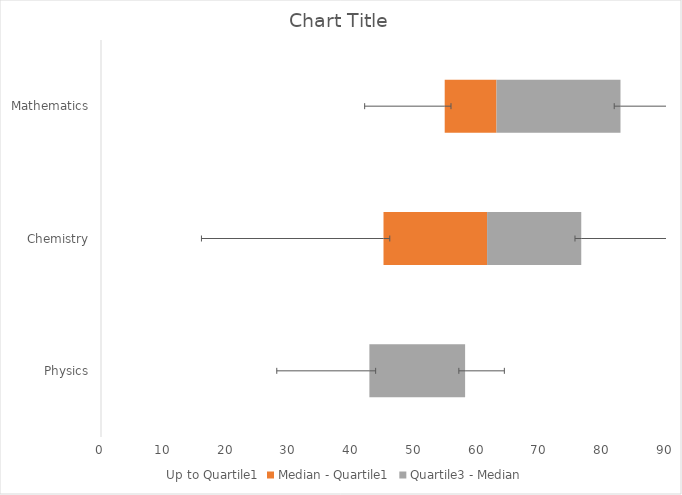
| Category | Up to Quartile1 | Median - Quartile1 | Quartile3 - Median |
|---|---|---|---|
| Physics | 42.75 | 0 | 15.25 |
| Chemistry | 45 | 16.5 | 15 |
| Mathematics | 54.75 | 8.25 | 19.75 |